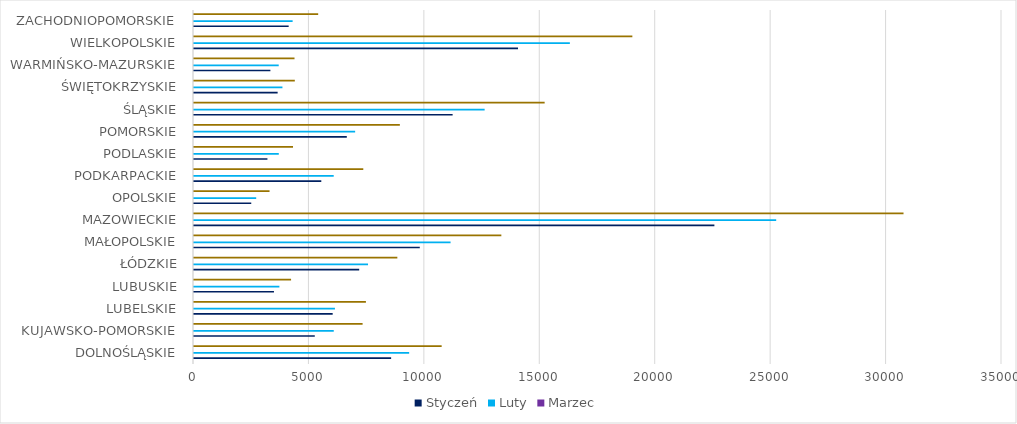
| Category | Series 0 | Serie2 | Styczeń | serie4 | Series 4 | Luty | Series 6 | Series 7 | Marzec | Series 9 | Series 10 |
|---|---|---|---|---|---|---|---|---|---|---|---|
| DOLNOŚLĄSKIE |  |  | 8539 |  |  | 9320 |  |  |  | 10728 |  |
| KUJAWSKO-POMORSKIE |  |  | 5232 |  |  | 6054 |  |  |  | 7303 |  |
| LUBELSKIE |  |  | 6007 |  |  | 6105 |  |  |  | 7447 |  |
| LUBUSKIE |  |  | 3464 |  |  | 3699 |  |  |  | 4205 |  |
| ŁÓDZKIE |  |  | 7156 |  |  | 7538 |  |  |  | 8808 |  |
| MAŁOPOLSKIE |  |  | 9780 |  |  | 11114 |  |  |  | 13313 |  |
| MAZOWIECKIE |  |  | 22542 |  |  | 25219 |  |  |  | 30734 |  |
| OPOLSKIE |  |  | 2480 |  |  | 2694 |  |  |  | 3272 |  |
| PODKARPACKIE |  |  | 5514 |  |  | 6052 |  |  |  | 7333 |  |
| PODLASKIE |  |  | 3181 |  |  | 3673 |  |  |  | 4289 |  |
| POMORSKIE |  |  | 6619 |  |  | 6980 |  |  |  | 8917 |  |
| ŚLĄSKIE |  |  | 11203 |  |  | 12590 |  |  |  | 15189 |  |
| ŚWIĘTOKRZYSKIE |  |  | 3623 |  |  | 3831 |  |  |  | 4367 |  |
| WARMIŃSKO-MAZURSKIE |  |  | 3309 |  |  | 3670 |  |  |  | 4354 |  |
| WIELKOPOLSKIE |  |  | 14035 |  |  | 16281 |  |  |  | 18988 |  |
| ZACHODNIOPOMORSKIE |  |  | 4101 |  |  | 4272 |  |  |  | 5379 |  |